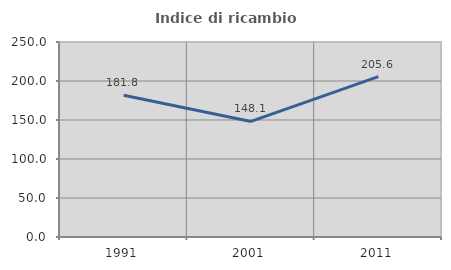
| Category | Indice di ricambio occupazionale  |
|---|---|
| 1991.0 | 181.818 |
| 2001.0 | 148.148 |
| 2011.0 | 205.556 |